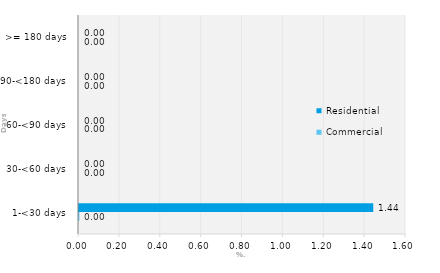
| Category | Commercial | Residential |
|---|---|---|
| 1-<30 days | 0.002 | 1.44 |
| 30-<60 days | 0 | 0 |
| 60-<90 days | 0 | 0 |
| 90-<180 days | 0 | 0 |
| >= 180 days | 0 | 0 |